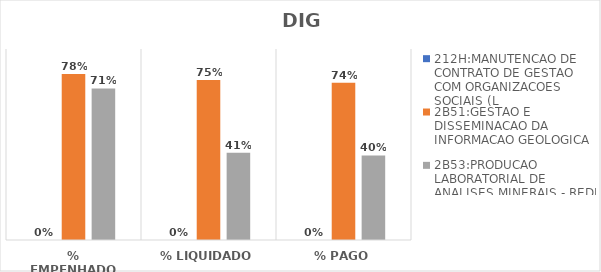
| Category | 212H:MANUTENCAO DE CONTRATO DE GESTAO COM ORGANIZACOES SOCIAIS (L | 2B51:GESTAO E DISSEMINACAO DA INFORMACAO GEOLOGICA | 2B53:PRODUCAO LABORATORIAL DE ANALISES MINERAIS - REDE LAMIN |
|---|---|---|---|
| % EMPENHADO | 0 | 0.782 | 0.714 |
| % LIQUIDADO | 0 | 0.754 | 0.411 |
| % PAGO | 0 | 0.741 | 0.398 |